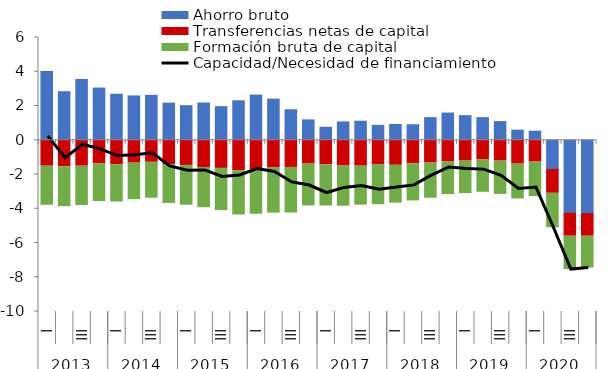
| Category | Ahorro bruto | Transferencias netas de capital | Formación bruta de capital |
|---|---|---|---|
| 0 | 4.021 | -1.515 | -2.283 |
| 1 | 2.834 | -1.547 | -2.331 |
| 2 | 3.551 | -1.516 | -2.298 |
| 3 | 3.046 | -1.371 | -2.21 |
| 4 | 2.684 | -1.43 | -2.176 |
| 5 | 2.588 | -1.336 | -2.133 |
| 6 | 2.621 | -1.286 | -2.097 |
| 7 | 2.166 | -1.441 | -2.251 |
| 8 | 2.018 | -1.471 | -2.324 |
| 9 | 2.176 | -1.592 | -2.347 |
| 10 | 1.96 | -1.643 | -2.464 |
| 11 | 2.305 | -1.773 | -2.591 |
| 12 | 2.637 | -1.729 | -2.595 |
| 13 | 2.403 | -1.622 | -2.635 |
| 14 | 1.783 | -1.587 | -2.658 |
| 15 | 1.188 | -1.388 | -2.446 |
| 16 | 0.759 | -1.434 | -2.406 |
| 17 | 1.069 | -1.506 | -2.345 |
| 18 | 1.112 | -1.512 | -2.276 |
| 19 | 0.868 | -1.444 | -2.319 |
| 20 | 0.92 | -1.463 | -2.21 |
| 21 | 0.906 | -1.374 | -2.168 |
| 22 | 1.321 | -1.331 | -2.056 |
| 23 | 1.588 | -1.26 | -1.916 |
| 24 | 1.434 | -1.215 | -1.901 |
| 25 | 1.321 | -1.152 | -1.884 |
| 26 | 1.089 | -1.218 | -1.946 |
| 27 | 0.59 | -1.392 | -2.038 |
| 28 | 0.528 | -1.273 | -2.021 |
| 29 | -1.704 | -1.396 | -2.011 |
| 30 | -4.266 | -1.339 | -1.948 |
| 31 | -4.285 | -1.322 | -1.856 |